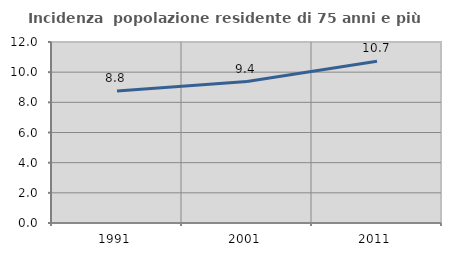
| Category | Incidenza  popolazione residente di 75 anni e più |
|---|---|
| 1991.0 | 8.755 |
| 2001.0 | 9.377 |
| 2011.0 | 10.727 |